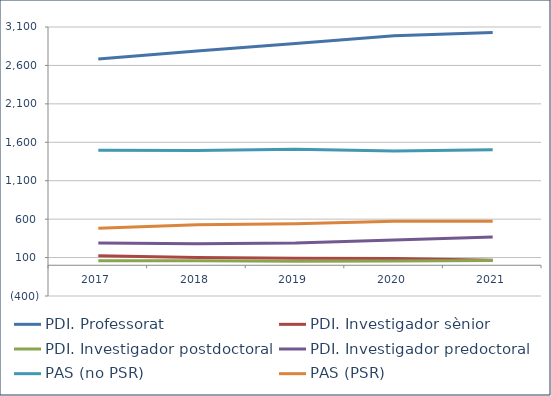
| Category | PDI. Professorat | PDI. Investigador sènior | PDI. Investigador postdoctoral | PDI. Investigador predoctoral | PAS (no PSR) | PAS (PSR) |
|---|---|---|---|---|---|---|
| 2017.0 | 2684 | 125 | 59 | 290 | 1497 | 481 |
| 2018.0 | 2788 | 100 | 60 | 279 | 1492 | 526 |
| 2019.0 | 2885 | 92 | 52 | 288 | 1511 | 541 |
| 2020.0 | 2987 | 88 | 56 | 328 | 1488 | 573 |
| 2021.0 | 3030 | 64 | 62 | 367 | 1503 | 571 |